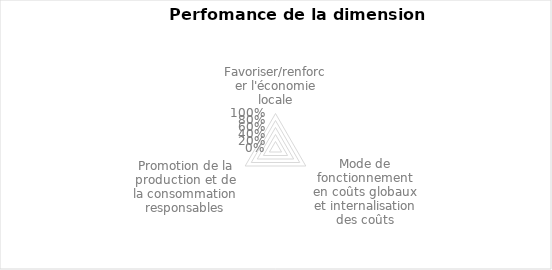
| Category | 0% |
|---|---|
| Favoriser/renforcer l'économie locale | 0 |
| Mode de fonctionnement en coûts globaux et internalisation des coûts | 0 |
| Promotion de la production et de la consommation responsables | 0 |